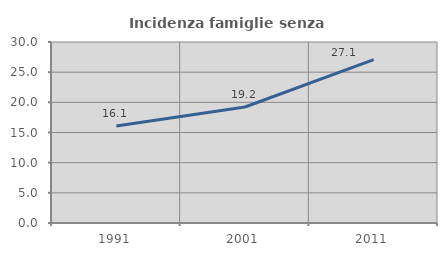
| Category | Incidenza famiglie senza nuclei |
|---|---|
| 1991.0 | 16.094 |
| 2001.0 | 19.228 |
| 2011.0 | 27.072 |